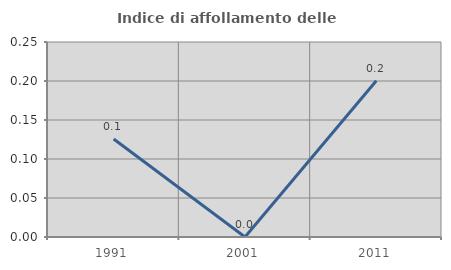
| Category | Indice di affollamento delle abitazioni  |
|---|---|
| 1991.0 | 0.126 |
| 2001.0 | 0 |
| 2011.0 | 0.2 |